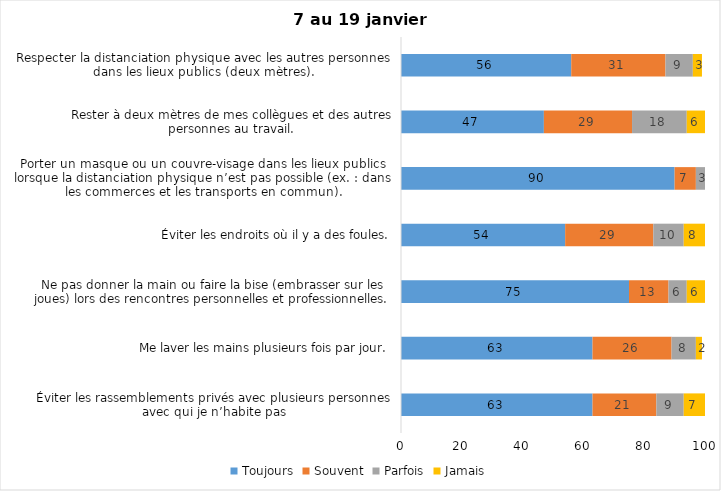
| Category | Toujours | Souvent | Parfois | Jamais |
|---|---|---|---|---|
| Éviter les rassemblements privés avec plusieurs personnes avec qui je n’habite pas | 63 | 21 | 9 | 7 |
| Me laver les mains plusieurs fois par jour. | 63 | 26 | 8 | 2 |
| Ne pas donner la main ou faire la bise (embrasser sur les joues) lors des rencontres personnelles et professionnelles. | 75 | 13 | 6 | 6 |
| Éviter les endroits où il y a des foules. | 54 | 29 | 10 | 8 |
| Porter un masque ou un couvre-visage dans les lieux publics lorsque la distanciation physique n’est pas possible (ex. : dans les commerces et les transports en commun). | 90 | 7 | 3 | 0 |
| Rester à deux mètres de mes collègues et des autres personnes au travail. | 47 | 29 | 18 | 6 |
| Respecter la distanciation physique avec les autres personnes dans les lieux publics (deux mètres). | 56 | 31 | 9 | 3 |